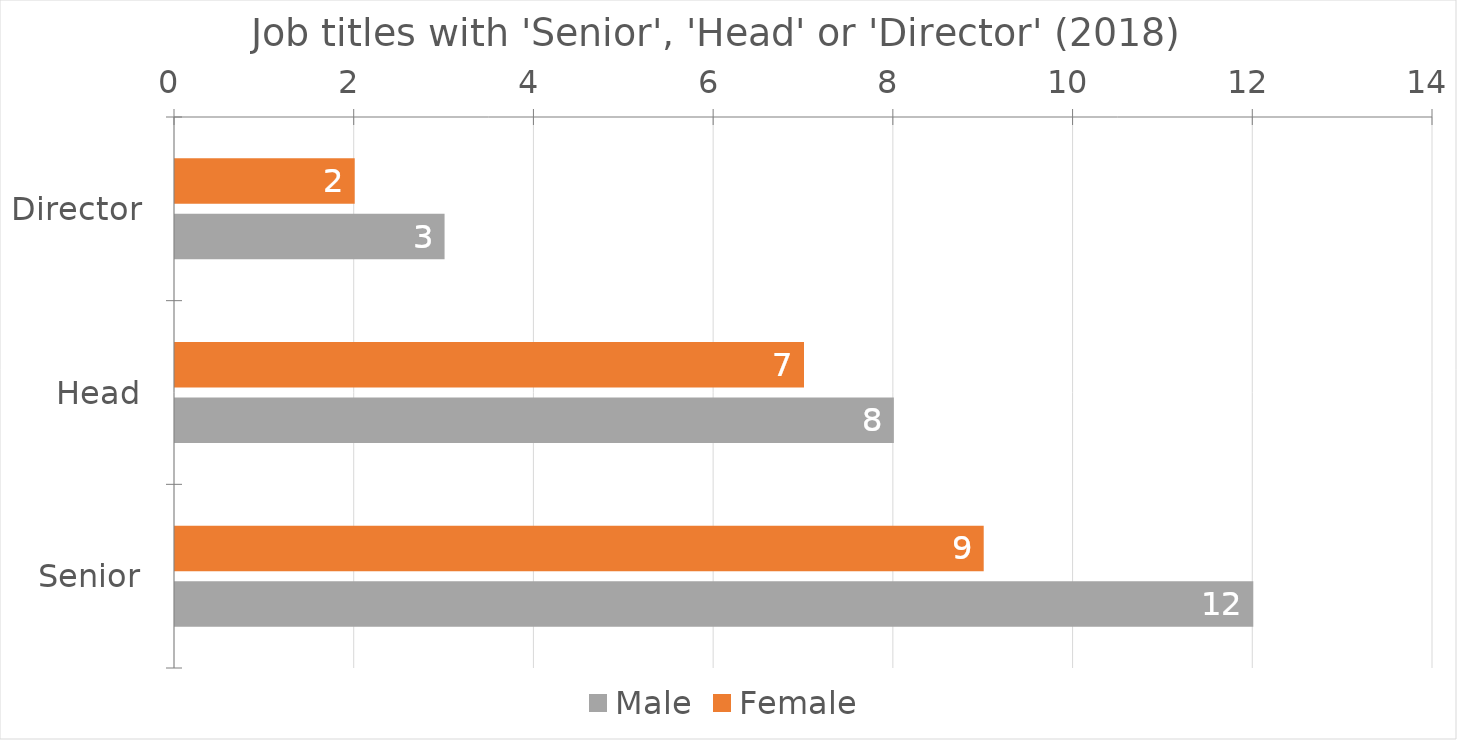
| Category | Male | Female |
|---|---|---|
| Senior | 12 | 9 |
| Head | 8 | 7 |
| Director | 3 | 2 |